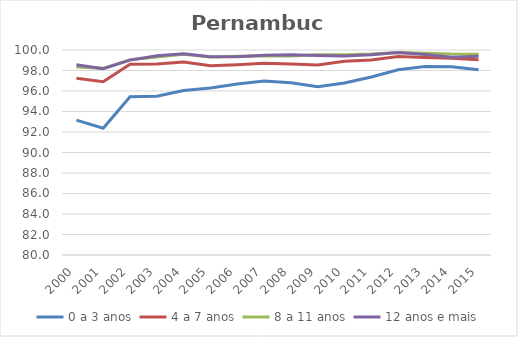
| Category | 0 a 3 anos | 4 a 7 anos | 8 a 11 anos | 12 anos e mais |
|---|---|---|---|---|
| 2000.0 | 93.158 | 97.248 | 98.351 | 98.561 |
| 2001.0 | 92.365 | 96.902 | 98.208 | 98.176 |
| 2002.0 | 95.434 | 98.609 | 99.059 | 99.011 |
| 2003.0 | 95.496 | 98.645 | 99.325 | 99.428 |
| 2004.0 | 96.044 | 98.826 | 99.586 | 99.637 |
| 2005.0 | 96.284 | 98.461 | 99.317 | 99.348 |
| 2006.0 | 96.677 | 98.562 | 99.386 | 99.343 |
| 2007.0 | 96.974 | 98.712 | 99.407 | 99.482 |
| 2008.0 | 96.812 | 98.623 | 99.42 | 99.526 |
| 2009.0 | 96.419 | 98.546 | 99.525 | 99.463 |
| 2010.0 | 96.787 | 98.905 | 99.539 | 99.412 |
| 2011.0 | 97.37 | 99.016 | 99.603 | 99.539 |
| 2012.0 | 98.071 | 99.376 | 99.744 | 99.747 |
| 2013.0 | 98.381 | 99.26 | 99.689 | 99.569 |
| 2014.0 | 98.375 | 99.192 | 99.608 | 99.284 |
| 2015.0 | 98.075 | 99.053 | 99.595 | 99.38 |